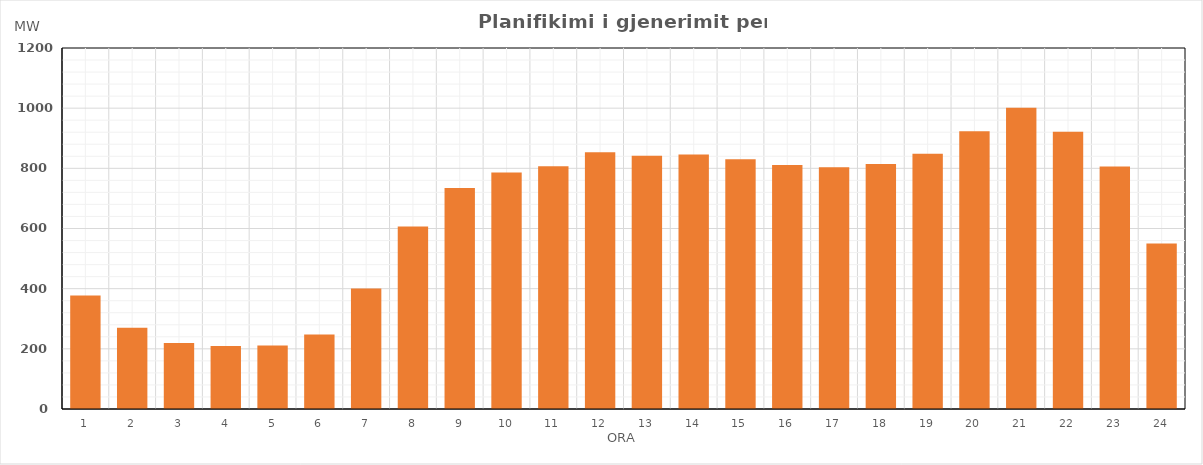
| Category | Max (MW) |
|---|---|
| 0 | 377.329 |
| 1 | 269.764 |
| 2 | 219.489 |
| 3 | 209.504 |
| 4 | 211.409 |
| 5 | 247.559 |
| 6 | 400.964 |
| 7 | 606.949 |
| 8 | 734.609 |
| 9 | 786.014 |
| 10 | 807.054 |
| 11 | 853.324 |
| 12 | 842.169 |
| 13 | 846.249 |
| 14 | 830.179 |
| 15 | 810.903 |
| 16 | 803.888 |
| 17 | 814.78 |
| 18 | 848.78 |
| 19 | 922.934 |
| 20 | 1001.014 |
| 21 | 922.004 |
| 22 | 805.81 |
| 23 | 549.829 |